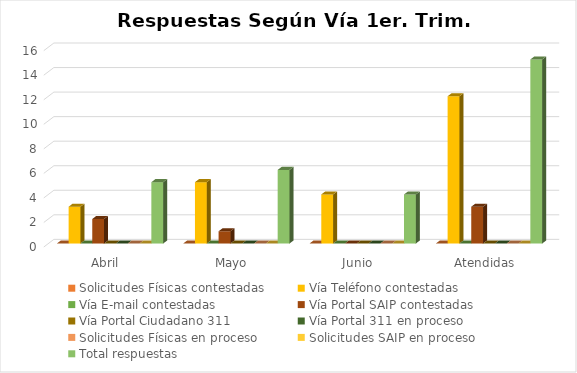
| Category | Solicitudes Físicas contestadas | Vía Teléfono contestadas | Vía E-mail contestadas | Vía Portal SAIP contestadas | Vía Portal Ciudadano 311  | Vía Portal 311 en proceso | Solicitudes Físicas en proceso | Solicitudes SAIP en proceso | Total respuestas  |
|---|---|---|---|---|---|---|---|---|---|
| Abril | 0 | 3 | 0 | 2 | 0 | 0 | 0 | 0 | 5 |
| Mayo | 0 | 5 | 0 | 1 | 0 | 0 | 0 | 0 | 6 |
| Junio | 0 | 4 | 0 | 0 | 0 | 0 | 0 | 0 | 4 |
| Atendidas | 0 | 12 | 0 | 3 | 0 | 0 | 0 | 0 | 15 |